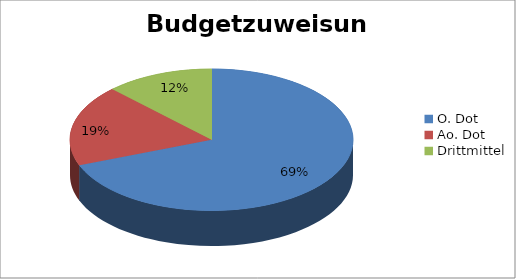
| Category | Series 0 |
|---|---|
| O. Dot | 56000 |
| Ao. Dot | 15000 |
| Drittmittel | 10000 |